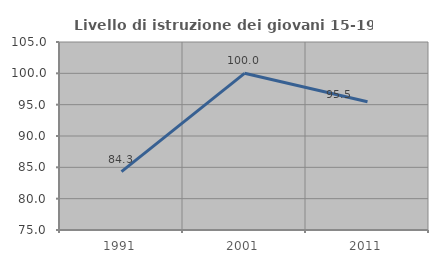
| Category | Livello di istruzione dei giovani 15-19 anni |
|---|---|
| 1991.0 | 84.314 |
| 2001.0 | 100 |
| 2011.0 | 95.455 |